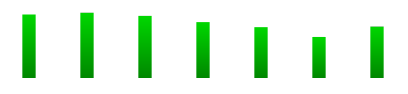
| Category | Series 0 |
|---|---|
| 0 | 0.163 |
| 1 | 0.167 |
| 2 | 0.159 |
| 3 | 0.143 |
| 4 | 0.13 |
| 5 | 0.105 |
| 6 | 0.132 |